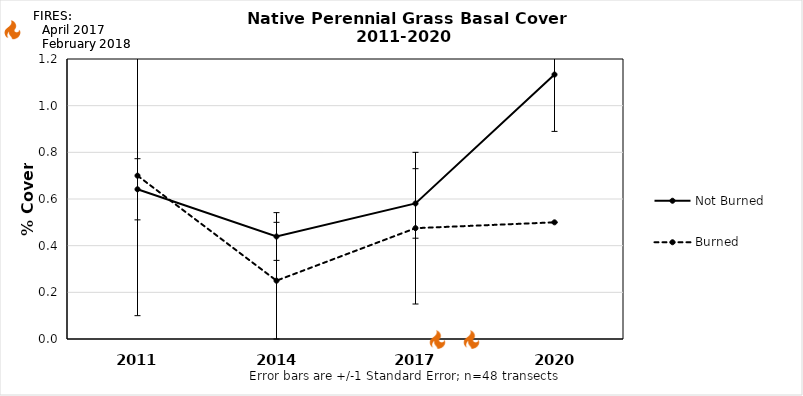
| Category | Not Burned | Burned |
|---|---|---|
| 2011.0 | 0.642 | 0.7 |
| 2014.0 | 0.439 | 0.25 |
| 2017.0 | 0.581 | 0.475 |
| 2020.0 | 1.133 | 0.5 |